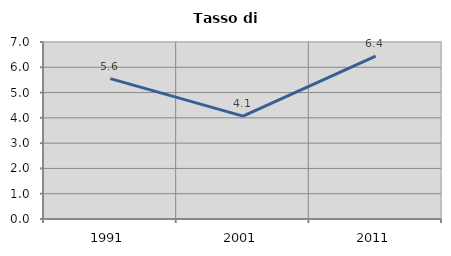
| Category | Tasso di disoccupazione   |
|---|---|
| 1991.0 | 5.552 |
| 2001.0 | 4.069 |
| 2011.0 | 6.438 |